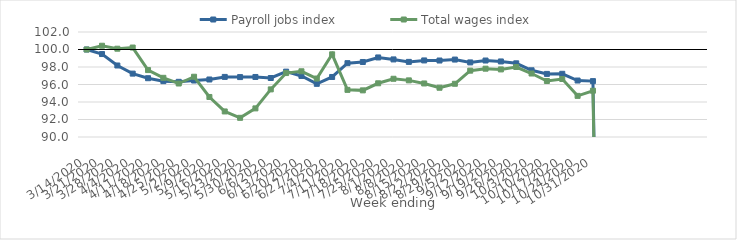
| Category | Payroll jobs index | Total wages index |
|---|---|---|
| 14/03/2020 | 100 | 100 |
| 21/03/2020 | 99.482 | 100.43 |
| 28/03/2020 | 98.173 | 100.091 |
| 04/04/2020 | 97.244 | 100.225 |
| 11/04/2020 | 96.718 | 97.648 |
| 18/04/2020 | 96.382 | 96.764 |
| 25/04/2020 | 96.306 | 96.114 |
| 02/05/2020 | 96.455 | 96.886 |
| 09/05/2020 | 96.572 | 94.573 |
| 16/05/2020 | 96.866 | 92.92 |
| 23/05/2020 | 96.847 | 92.191 |
| 30/05/2020 | 96.859 | 93.271 |
| 06/06/2020 | 96.742 | 95.442 |
| 13/06/2020 | 97.469 | 97.307 |
| 20/06/2020 | 96.976 | 97.51 |
| 27/06/2020 | 96.075 | 96.681 |
| 04/07/2020 | 96.859 | 99.45 |
| 11/07/2020 | 98.438 | 95.387 |
| 18/07/2020 | 98.573 | 95.329 |
| 25/07/2020 | 99.093 | 96.139 |
| 01/08/2020 | 98.867 | 96.654 |
| 08/08/2020 | 98.585 | 96.473 |
| 15/08/2020 | 98.751 | 96.119 |
| 22/08/2020 | 98.74 | 95.63 |
| 29/08/2020 | 98.85 | 96.083 |
| 05/09/2020 | 98.524 | 97.581 |
| 12/09/2020 | 98.74 | 97.809 |
| 19/09/2020 | 98.634 | 97.724 |
| 26/09/2020 | 98.42 | 98 |
| 03/10/2020 | 97.624 | 97.255 |
| 10/10/2020 | 97.212 | 96.401 |
| 17/10/2020 | 97.222 | 96.628 |
| 24/10/2020 | 96.454 | 94.7 |
| 31/10/2020 | 96.387 | 95.291 |